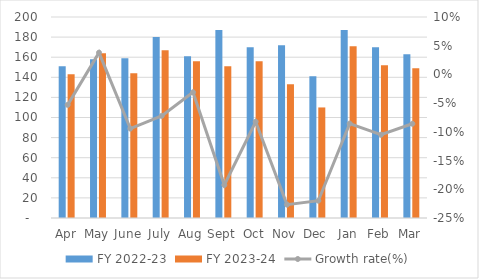
| Category | FY 2022-23 | FY 2023-24 |
|---|---|---|
| Apr | 151 | 143 |
| May | 158 | 164 |
| June | 159 | 144 |
| July | 180 | 167 |
| Aug | 161 | 156 |
| Sept | 187 | 151 |
| Oct | 170 | 156 |
| Nov | 172 | 133 |
| Dec | 141 | 110 |
| Jan | 187 | 171 |
| Feb | 169.826 | 152 |
| Mar | 163 | 149 |